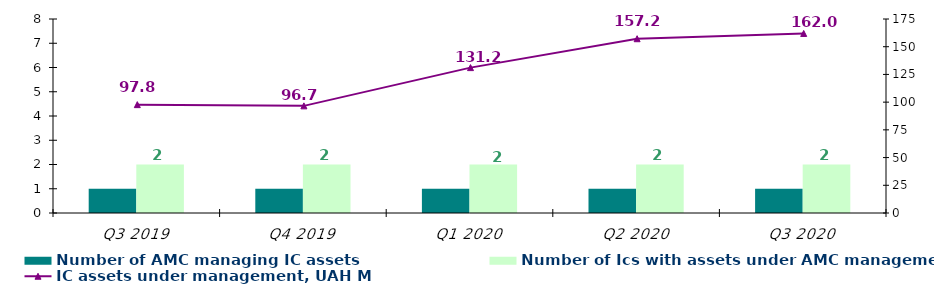
| Category | Number of AMC managing IC assets | Number of Ics with assets under AMC management |
|---|---|---|
| Q3 2019 | 1 | 2 |
| Q4 2019 | 1 | 2 |
| Q1 2020 | 1 | 2 |
| Q2 2020 | 1 | 2 |
| Q3 2020 | 1 | 2 |